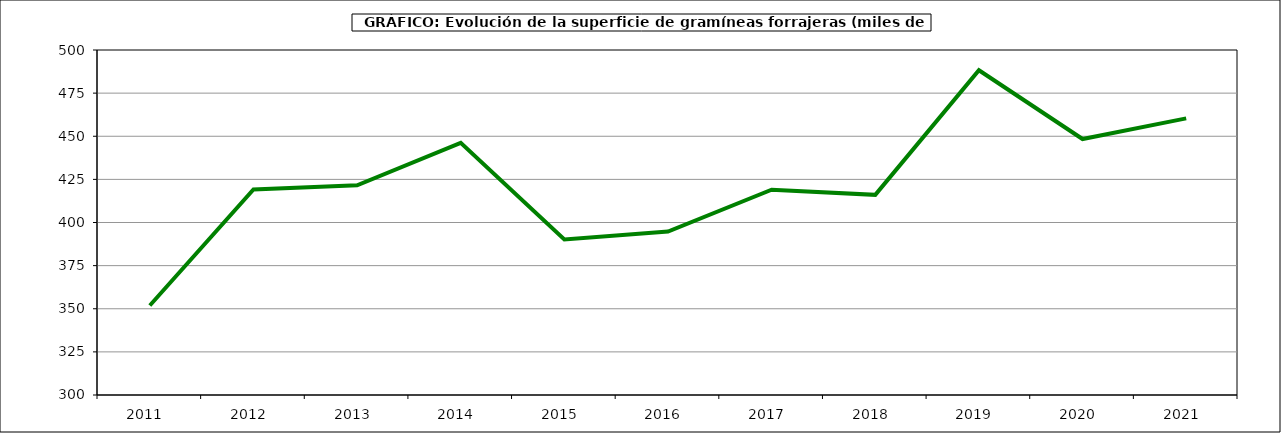
| Category | Superficie |
|---|---|
| 2011.0 | 351.87 |
| 2012.0 | 419.197 |
| 2013.0 | 421.523 |
| 2014.0 | 446.163 |
| 2015.0 | 390.211 |
| 2016.0 | 394.792 |
| 2017.0 | 418.976 |
| 2018.0 | 416.034 |
| 2019.0 | 488.269 |
| 2020.0 | 448.392 |
| 2021.0 | 460.381 |